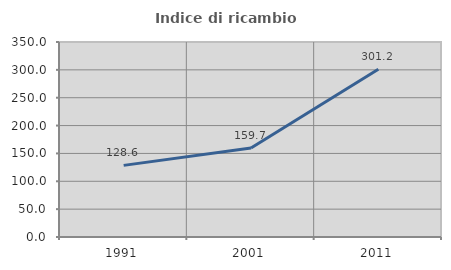
| Category | Indice di ricambio occupazionale  |
|---|---|
| 1991.0 | 128.571 |
| 2001.0 | 159.748 |
| 2011.0 | 301.242 |